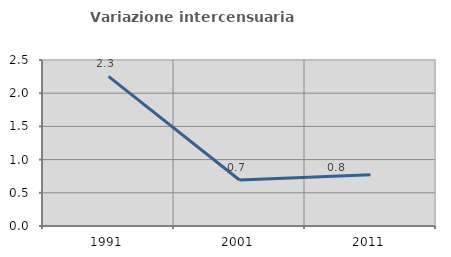
| Category | Variazione intercensuaria annua |
|---|---|
| 1991.0 | 2.253 |
| 2001.0 | 0.693 |
| 2011.0 | 0.77 |